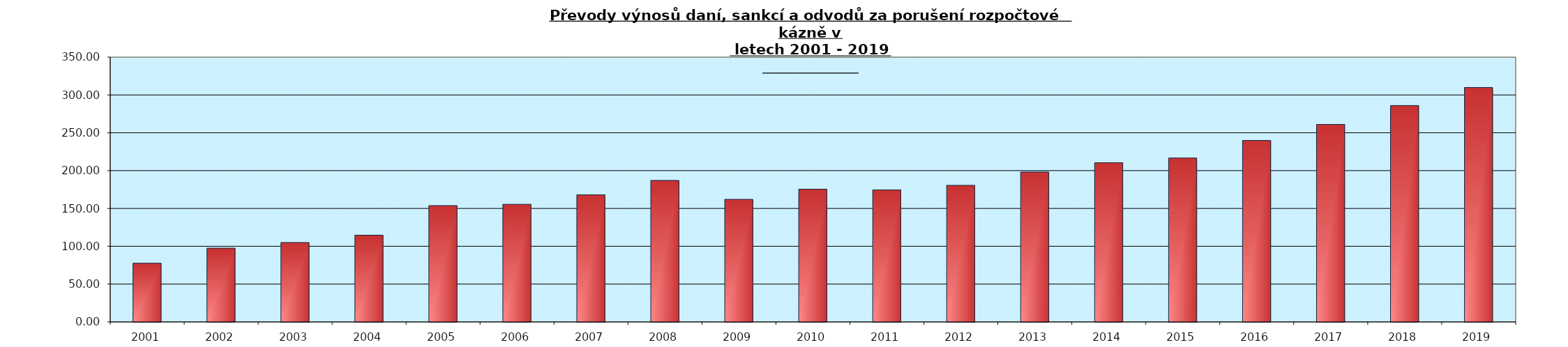
| Category | 2001 |
|---|---|
| 2001.0 | 77.62 |
| 2002.0 | 97.559 |
| 2003.0 | 104.974 |
| 2004.0 | 114.659 |
| 2005.0 | 153.772 |
| 2006.0 | 155.476 |
| 2007.0 | 167.992 |
| 2008.0 | 187.032 |
| 2009.0 | 162.022 |
| 2010.0 | 175.47 |
| 2011.0 | 174.461 |
| 2012.0 | 180.539 |
| 2013.0 | 198.134 |
| 2014.0 | 210.384 |
| 2015.0 | 216.671 |
| 2016.0 | 239.846 |
| 2017.0 | 261.032 |
| 2018.0 | 286.1 |
| 2019.0 | 309.86 |